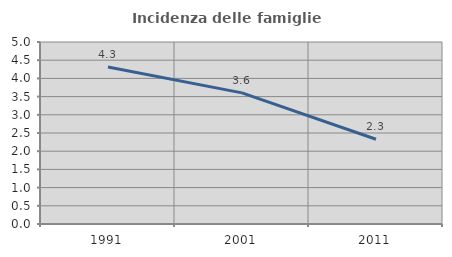
| Category | Incidenza delle famiglie numerose |
|---|---|
| 1991.0 | 4.314 |
| 2001.0 | 3.603 |
| 2011.0 | 2.329 |